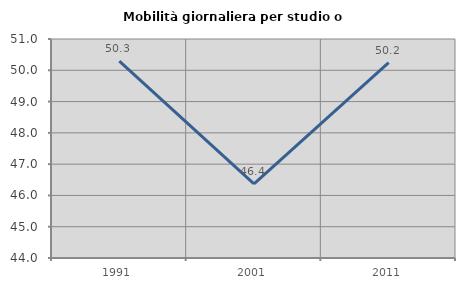
| Category | Mobilità giornaliera per studio o lavoro |
|---|---|
| 1991.0 | 50.293 |
| 2001.0 | 46.371 |
| 2011.0 | 50.246 |